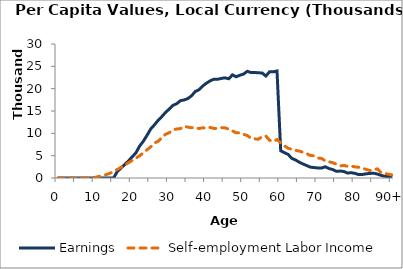
| Category | Earnings | Self-employment Labor Income |
|---|---|---|
| 0 | 0 | 0 |
|  | 0 | 0 |
| 2 | 0 | 0 |
| 3 | 0 | 0 |
| 4 | 0 | 0 |
| 5 | 0 | 0 |
| 6 | 0 | 0 |
| 7 | 0 | 0 |
| 8 | 0 | 0 |
| 9 | 0 | 38.857 |
| 10 | 0 | 147.62 |
| 11 | 0 | 329.446 |
| 12 | 0 | 511.271 |
| 13 | 0 | 758.922 |
| 14 | 0 | 1046.334 |
| 15 | 0 | 1496.821 |
| 16 | 1448.159 | 1913.326 |
| 17 | 2228.892 | 2372.008 |
| 18 | 3011.177 | 2879.54 |
| 19 | 3807.432 | 3419.858 |
| 20 | 4738.723 | 3909.147 |
| 21 | 5609.481 | 4438.519 |
| 22 | 7125.935 | 4958.208 |
| 23 | 8221.755 | 5631.37 |
| 24 | 9544.189 | 6321.851 |
| 25 | 10979.931 | 6963.584 |
| 26 | 11889.493 | 7837.99 |
| 27 | 12913.914 | 8220.13 |
| 28 | 13755.181 | 9047.891 |
| 29 | 14688.025 | 9789.405 |
| 30 | 15447.028 | 10151.258 |
| 31 | 16269.669 | 10776.837 |
| 32 | 16628.216 | 10975.95 |
| 33 | 17314.268 | 11053.454 |
| 34 | 17471.035 | 11588.247 |
| 35 | 17789.227 | 11393.652 |
| 36 | 18402.327 | 11252.949 |
| 37 | 19372.423 | 11292.955 |
| 38 | 19755.805 | 11072.429 |
| 39 | 20593.967 | 11251.18 |
| 40 | 21236.559 | 11129.567 |
| 41 | 21754.978 | 11321.308 |
| 42 | 22118.182 | 11105.592 |
| 43 | 22088.691 | 11110.985 |
| 44 | 22295.127 | 11280.619 |
| 45 | 22423.956 | 11222.079 |
| 46 | 22212.863 | 10937.052 |
| 47 | 23083.621 | 10555.664 |
| 48 | 22659.883 | 10106.716 |
| 49 | 23009.118 | 10117.52 |
| 50 | 23266.775 | 9774.793 |
| 51 | 23889.188 | 9514.261 |
| 52 | 23609.801 | 8875.977 |
| 53 | 23626.874 | 8777.132 |
| 54 | 23549.267 | 8677.324 |
| 55 | 23513.567 | 9284.663 |
| 56 | 22830.62 | 9393.237 |
| 57 | 23788.298 | 8438.213 |
| 58 | 23765.016 | 8181.352 |
| 59 | 23952.827 | 8620.256 |
| 60 | 6084.44 | 7849.242 |
| 61 | 5680.88 | 7198.073 |
| 62 | 5275.768 | 6656.917 |
| 63 | 4387.937 | 6409.193 |
| 64 | 4035.598 | 6181.219 |
| 65 | 3543.566 | 6027.955 |
| 66 | 3136.901 | 5761.71 |
| 67 | 2784.563 | 5447.33 |
| 68 | 2430.672 | 5043.981 |
| 69 | 2339.095 | 4974.871 |
| 70 | 2238.205 | 4479.306 |
| 71 | 2227.34 | 4386.299 |
| 72 | 2509.832 | 3837.784 |
| 73 | 2107.824 | 3624.071 |
| 74 | 1901.388 | 3438.479 |
| 75 | 1491.619 | 3076.749 |
| 76 | 1553.705 | 2704.525 |
| 77 | 1457.472 | 2817.723 |
| 78 | 1109.789 | 2610.471 |
| 79 | 1182.741 | 2655.744 |
| 80 | 1035.286 | 2483.001 |
| 81 | 759.003 | 2410.443 |
| 82 | 790.046 | 2204.598 |
| 83 | 939.053 | 1929.375 |
| 84 | 1019.765 | 1654.178 |
| 85 | 1070.986 | 1831.517 |
| 86 | 890.936 | 2043.309 |
| 87 | 602.235 | 1208.17 |
| 88 | 377.173 | 1030.068 |
| 89 | 335.265 | 851.966 |
| 90+ | 291.805 | 673.864 |